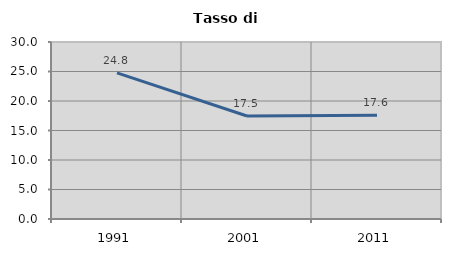
| Category | Tasso di disoccupazione   |
|---|---|
| 1991.0 | 24.773 |
| 2001.0 | 17.46 |
| 2011.0 | 17.59 |